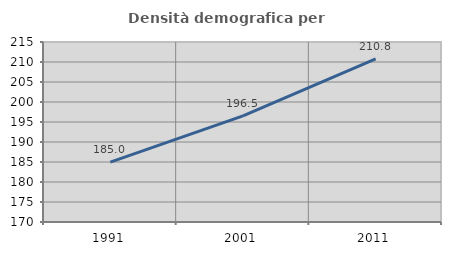
| Category | Densità demografica |
|---|---|
| 1991.0 | 184.975 |
| 2001.0 | 196.511 |
| 2011.0 | 210.753 |